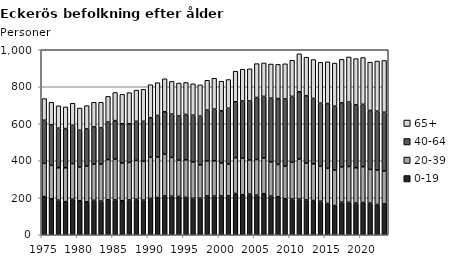
| Category | 0-19 | 20-39 | 40-64 | 65+ |
|---|---|---|---|---|
| 1975.0 | 206 | 180 | 233 | 117 |
| 1976.0 | 195 | 180 | 219 | 122 |
| 1977.0 | 187 | 175 | 214 | 121 |
| 1978.0 | 179 | 183 | 212 | 117 |
| 1979.0 | 192 | 193 | 207 | 119 |
| 1980.0 | 184 | 182 | 199 | 120 |
| 1981.0 | 178 | 193 | 201 | 126 |
| 1982.0 | 186 | 196 | 201 | 133 |
| 1983.0 | 182 | 199 | 196 | 139 |
| 1984.0 | 189 | 217 | 203 | 139 |
| 1985.0 | 188 | 220 | 209 | 152 |
| 1986.0 | 184 | 204 | 212 | 159 |
| 1987.0 | 188 | 203 | 209 | 168 |
| 1988.0 | 192 | 210 | 211 | 169 |
| 1989.0 | 187 | 210 | 216 | 173 |
| 1990.0 | 197 | 222 | 214 | 178 |
| 1991.0 | 201 | 219 | 225 | 177 |
| 1992.0 | 210 | 225 | 230 | 178 |
| 1993.0 | 208 | 210 | 234 | 177 |
| 1994.0 | 207 | 196 | 239 | 178 |
| 1995.0 | 202 | 203 | 245 | 173 |
| 1996.0 | 197 | 197 | 252 | 170 |
| 1997.0 | 198 | 180 | 263 | 169 |
| 1998.0 | 210 | 189 | 275 | 161 |
| 1999.0 | 209 | 191 | 279 | 167 |
| 2000.0 | 210 | 178 | 282 | 160 |
| 2001.0 | 210 | 172 | 302 | 155 |
| 2002.0 | 223 | 194 | 302 | 165 |
| 2003.0 | 216 | 198 | 309 | 172 |
| 2004.0 | 220 | 184 | 319 | 174 |
| 2005.0 | 214 | 193 | 335 | 183 |
| 2006.0 | 222 | 193 | 333 | 181 |
| 2007.0 | 209 | 185 | 344 | 185 |
| 2008.0 | 205 | 175 | 356 | 185 |
| 2009.0 | 195 | 176 | 363 | 190 |
| 2010.0 | 193 | 199 | 356 | 195 |
| 2011.0 | 193 | 216 | 364 | 205 |
| 2012.0 | 188 | 199 | 364 | 209 |
| 2013.0 | 185 | 198 | 354 | 210 |
| 2014.0 | 181 | 189 | 341 | 221 |
| 2015.0 | 169 | 190 | 350 | 226 |
| 2016.0 | 158 | 192 | 345 | 233 |
| 2017.0 | 176 | 191 | 346 | 235 |
| 2018.0 | 175 | 194 | 348 | 244 |
| 2019.0 | 171 | 191 | 340 | 250 |
| 2020.0 | 174 | 194 | 337 | 253 |
| 2021.0 | 171 | 182 | 319 | 261 |
| 2022.0 | 164 | 185 | 319 | 271 |
| 2023.0 | 167 | 178 | 317 | 280 |